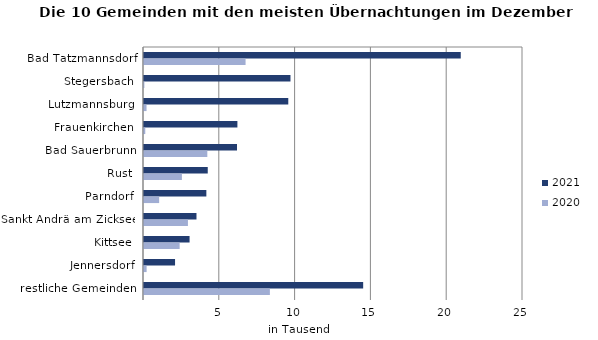
| Category | 2021 | 2020 |
|---|---|---|
| Bad Tatzmannsdorf | 20895 | 6700 |
| Stegersbach | 9662 | 24 |
| Lutzmannsburg | 9517 | 167 |
| Frauenkirchen | 6161 | 84 |
| Bad Sauerbrunn | 6135 | 4177 |
| Rust | 4205 | 2500 |
| Parndorf | 4113 | 1000 |
| Sankt Andrä am Zicksee | 3462 | 2898 |
| Kittsee | 3006 | 2352 |
| Jennersdorf | 2048 | 172 |
| restliche Gemeinden | 14457 | 8304 |